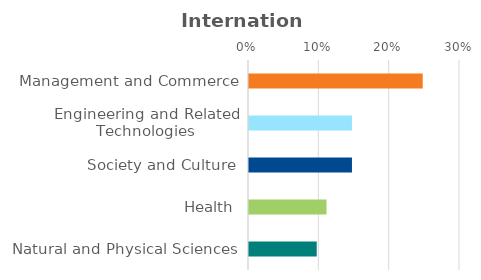
| Category | Series 0 |
|---|---|
| Management and Commerce | 0.247 |
| Engineering and Related Technologies | 0.146 |
| Society and Culture | 0.146 |
| Health | 0.11 |
| Natural and Physical Sciences | 0.096 |